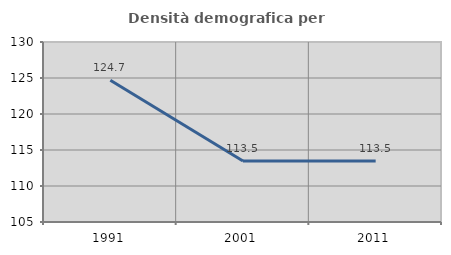
| Category | Densità demografica |
|---|---|
| 1991.0 | 124.675 |
| 2001.0 | 113.46 |
| 2011.0 | 113.46 |